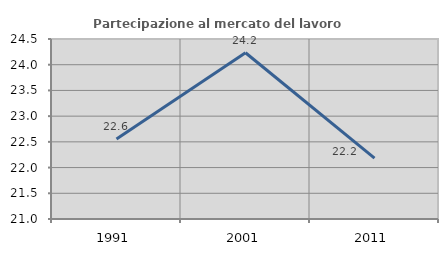
| Category | Partecipazione al mercato del lavoro  femminile |
|---|---|
| 1991.0 | 22.556 |
| 2001.0 | 24.233 |
| 2011.0 | 22.183 |